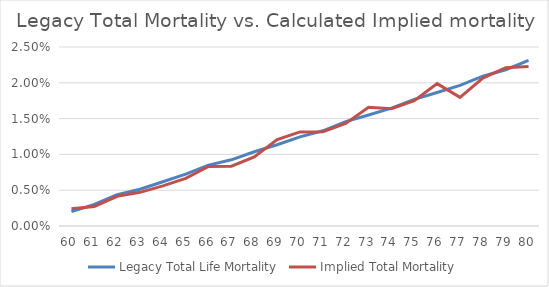
| Category | Legacy Total Life Mortality | Implied Total Mortality |
|---|---|---|
| 0 | 0.002 | 0.002 |
| 1 | 0.003 | 0.003 |
| 2 | 0.004 | 0.004 |
| 3 | 0.005 | 0.005 |
| 4 | 0.006 | 0.006 |
| 5 | 0.007 | 0.007 |
| 6 | 0.009 | 0.008 |
| 7 | 0.009 | 0.008 |
| 8 | 0.01 | 0.01 |
| 9 | 0.011 | 0.012 |
| 10 | 0.012 | 0.013 |
| 11 | 0.013 | 0.013 |
| 12 | 0.015 | 0.014 |
| 13 | 0.015 | 0.017 |
| 14 | 0.016 | 0.016 |
| 15 | 0.018 | 0.017 |
| 16 | 0.019 | 0.02 |
| 17 | 0.02 | 0.018 |
| 18 | 0.021 | 0.021 |
| 19 | 0.022 | 0.022 |
| 20 | 0.023 | 0.022 |